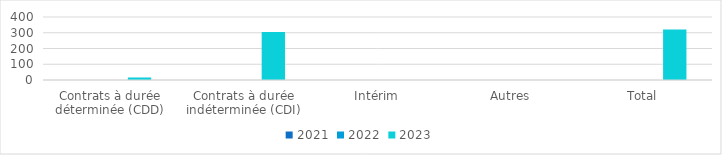
| Category | 2021 | 2022 | 2023 |
|---|---|---|---|
| Contrats à durée déterminée (CDD) | 0 | 0 | 16 |
| Contrats à durée indéterminée (CDI) | 0 | 0 | 304 |
| Intérim | 0 | 0 | 0 |
| Autres | 0 | 0 | 0 |
| Total  | 0 | 0 | 320 |